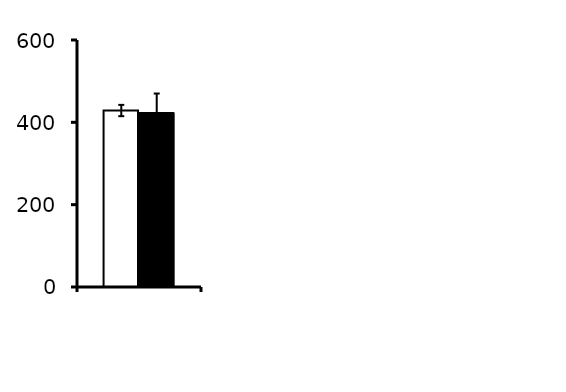
| Category | Lmna-WT | Lmna |
|---|---|---|
| HR (bpm) | 428.686 | 423.812 |